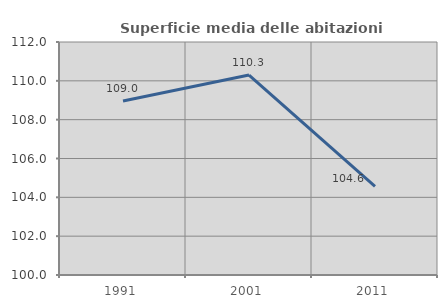
| Category | Superficie media delle abitazioni occupate |
|---|---|
| 1991.0 | 108.964 |
| 2001.0 | 110.297 |
| 2011.0 | 104.56 |